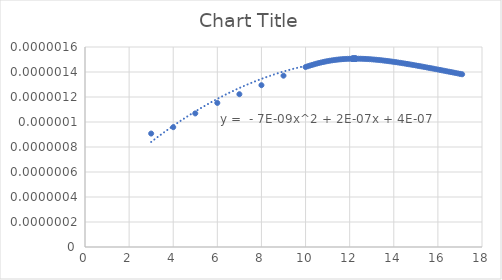
| Category | Series 0 |
|---|---|
| 3.0 | 0 |
| 4.0 | 0 |
| 5.0 | 0 |
| 6.0 | 0 |
| 7.0 | 0 |
| 8.0 | 0 |
| 9.0 | 0 |
| 10.0 | 0 |
| 10.1 | 0 |
| 10.2 | 0 |
| 10.299999999999999 | 0 |
| 10.399999999999999 | 0 |
| 10.499999999999998 | 0 |
| 10.599999999999998 | 0 |
| 10.699999999999998 | 0 |
| 10.799999999999997 | 0 |
| 10.899999999999997 | 0 |
| 10.999999999999996 | 0 |
| 11.099999999999996 | 0 |
| 11.199999999999996 | 0 |
| 11.299999999999995 | 0 |
| 11.399999999999995 | 0 |
| 11.499999999999995 | 0 |
| 11.599999999999994 | 0 |
| 11.699999999999994 | 0 |
| 11.799999999999994 | 0 |
| 11.899999999999993 | 0 |
| 11.999999999999993 | 0 |
| 12.099999999999993 | 0 |
| 12.109999999999992 | 0 |
| 12.119999999999992 | 0 |
| 12.129999999999992 | 0 |
| 12.139999999999992 | 0 |
| 12.149999999999991 | 0 |
| 12.159999999999991 | 0 |
| 12.169999999999991 | 0 |
| 12.17999999999999 | 0 |
| 12.18999999999999 | 0 |
| 12.19999999999999 | 0 |
| 12.20999999999999 | 0 |
| 12.21999999999999 | 0 |
| 12.22999999999999 | 0 |
| 12.23999999999999 | 0 |
| 12.24999999999999 | 0 |
| 12.25999999999999 | 0 |
| 12.269999999999989 | 0 |
| 12.279999999999989 | 0 |
| 12.289999999999988 | 0 |
| 12.29999999999999 | 0 |
| 12.39999999999999 | 0 |
| 12.49999999999999 | 0 |
| 12.599999999999989 | 0 |
| 12.699999999999989 | 0 |
| 12.799999999999988 | 0 |
| 12.899999999999988 | 0 |
| 12.999999999999988 | 0 |
| 13.099999999999987 | 0 |
| 13.199999999999987 | 0 |
| 13.299999999999986 | 0 |
| 13.399999999999986 | 0 |
| 13.499999999999986 | 0 |
| 13.599999999999985 | 0 |
| 13.699999999999985 | 0 |
| 13.799999999999985 | 0 |
| 13.899999999999984 | 0 |
| 13.999999999999984 | 0 |
| 14.099999999999984 | 0 |
| 14.199999999999983 | 0 |
| 14.299999999999983 | 0 |
| 14.399999999999983 | 0 |
| 14.499999999999982 | 0 |
| 14.599999999999982 | 0 |
| 14.699999999999982 | 0 |
| 14.799999999999981 | 0 |
| 14.89999999999998 | 0 |
| 14.99999999999998 | 0 |
| 15.09999999999998 | 0 |
| 15.19999999999998 | 0 |
| 15.29999999999998 | 0 |
| 15.399999999999979 | 0 |
| 15.499999999999979 | 0 |
| 15.599999999999978 | 0 |
| 15.699999999999978 | 0 |
| 15.799999999999978 | 0 |
| 15.899999999999977 | 0 |
| 15.999999999999977 | 0 |
| 16.099999999999977 | 0 |
| 16.199999999999978 | 0 |
| 16.29999999999998 | 0 |
| 16.39999999999998 | 0 |
| 16.499999999999982 | 0 |
| 16.599999999999984 | 0 |
| 16.699999999999985 | 0 |
| 16.799999999999986 | 0 |
| 16.899999999999988 | 0 |
| 16.99999999999999 | 0 |
| 17.09999999999999 | 0 |